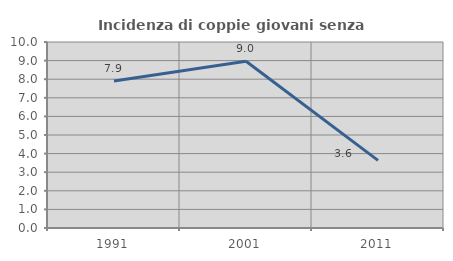
| Category | Incidenza di coppie giovani senza figli |
|---|---|
| 1991.0 | 7.902 |
| 2001.0 | 8.967 |
| 2011.0 | 3.635 |